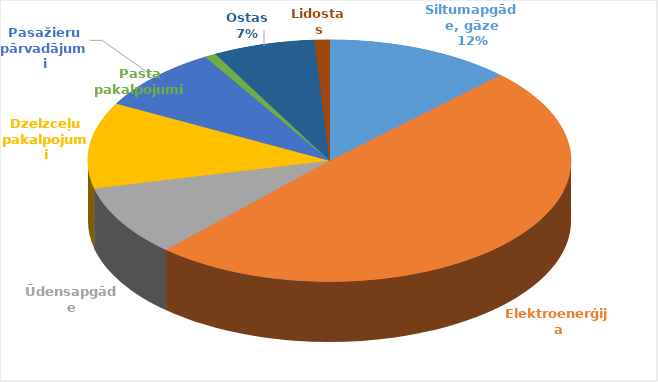
| Category | Series 0 | Series 1 |
|---|---|---|
| Siltumapgāde, gāze | 100200339 | 0.125 |
| Elektroenerģija | 395884792 | 0.493 |
| Ūdensapgāde | 76104087 | 0.095 |
| Dzelzceļu pakalpojumi | 92637819 | 0.115 |
| Pasažieru pārvadājumi | 68941942 | 0.086 |
| Pasta pakalpojumi | 6154049 | 0.008 |
| Ostas | 54661206 | 0.068 |
| Lidostas | 8091028 | 0.01 |